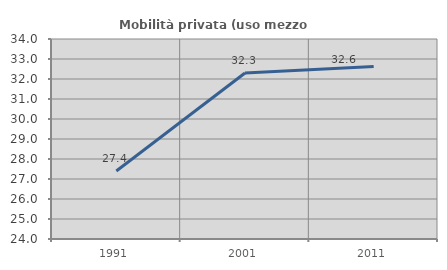
| Category | Mobilità privata (uso mezzo privato) |
|---|---|
| 1991.0 | 27.397 |
| 2001.0 | 32.302 |
| 2011.0 | 32.622 |